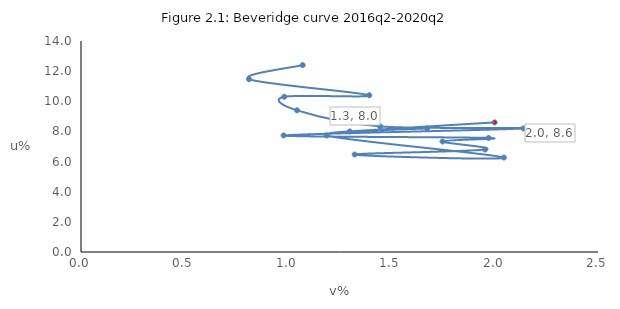
| Category | Unemployment rate |
|---|---|
| 1.0719141459229091 | 12.4 |
| 0.8124422469968439 | 11.467 |
| 1.393849044636956 | 10.4 |
| 0.9828009828009828 | 10.3 |
| 1.044678693943308 | 9.4 |
| 1.446831472800243 | 8.333 |
| 2.1396418395282573 | 8.2 |
| 0.9797008300002312 | 7.733 |
| 1.971480301232394 | 7.567 |
| 1.7481382797021248 | 7.333 |
| 1.9543884655446522 | 6.8 |
| 1.3233111832042588 | 6.467 |
| 2.044892470054591 | 6.267 |
| 1.1878159917007003 | 7.733 |
| 1.6741280137162213 | 8.2 |
| 1.3 | 8 |
| 2.0 | 8.6 |